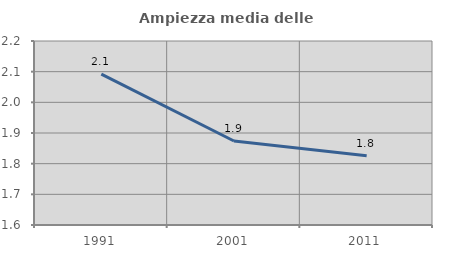
| Category | Ampiezza media delle famiglie |
|---|---|
| 1991.0 | 2.092 |
| 2001.0 | 1.874 |
| 2011.0 | 1.826 |